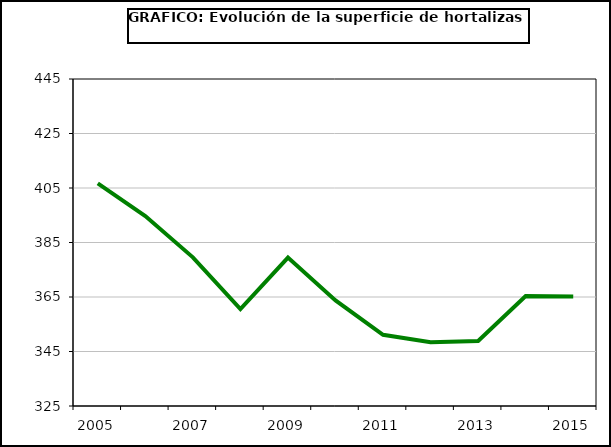
| Category | superficie |
|---|---|
| 2005.0 | 406.688 |
| 2006.0 | 394.718 |
| 2007.0 | 379.564 |
| 2008.0 | 360.539 |
| 2009.0 | 379.479 |
| 2010.0 | 363.729 |
| 2011.0 | 351.145 |
| 2012.0 | 348.359 |
| 2013.0 | 348.853 |
| 2014.0 | 365.385 |
| 2015.0 | 365.178 |